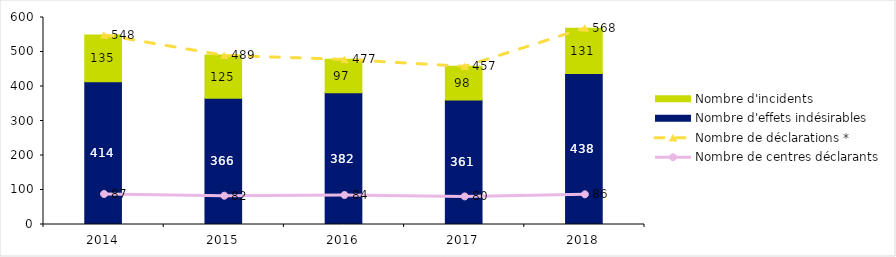
| Category | Nombre d'effets indésirables | Nombre d'incidents |
|---|---|---|
| 2014.0 | 414 | 135 |
| 2015.0 | 366 | 125 |
| 2016.0 | 382 | 97 |
| 2017.0 | 361 | 98 |
| 2018.0 | 438 | 131 |